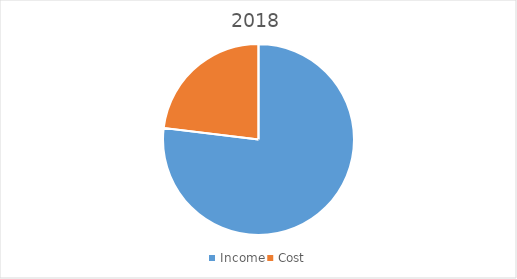
| Category | 2018 |
|---|---|
| Income | 10 |
| Cost | 3 |